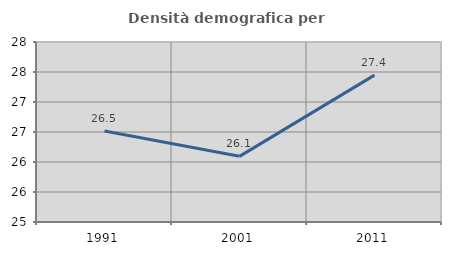
| Category | Densità demografica |
|---|---|
| 1991.0 | 26.517 |
| 2001.0 | 26.094 |
| 2011.0 | 27.448 |